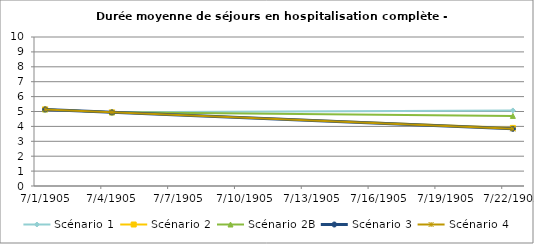
| Category | Scénario 1 | Scénario 2 | Scénario 2B | Scénario 3 | Scénario 4 |
|---|---|---|---|---|---|
| 2009.0 | 5.142 | 5.142 | 5.142 | 5.142 | 5.142 |
| 2012.0 | 4.942 | 4.942 | 4.942 | 4.942 | 4.942 |
| 2030.0 | 5.07 | 3.9 | 4.704 | 3.834 | 3.834 |